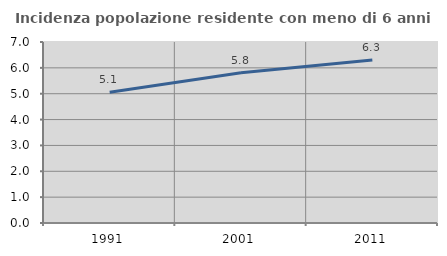
| Category | Incidenza popolazione residente con meno di 6 anni |
|---|---|
| 1991.0 | 5.06 |
| 2001.0 | 5.811 |
| 2011.0 | 6.303 |